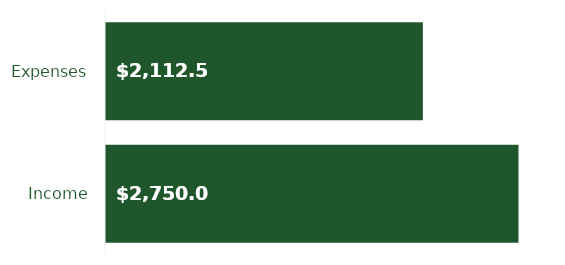
| Category | Income |
|---|---|
| Income | 2750 |
| Expenses | 2112.5 |